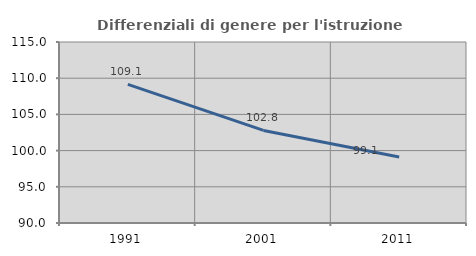
| Category | Differenziali di genere per l'istruzione superiore |
|---|---|
| 1991.0 | 109.136 |
| 2001.0 | 102.785 |
| 2011.0 | 99.113 |